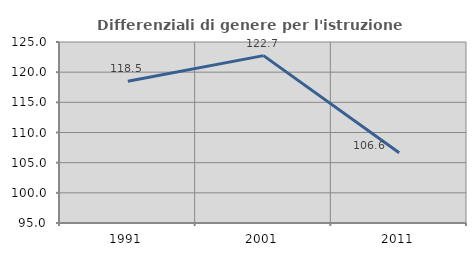
| Category | Differenziali di genere per l'istruzione superiore |
|---|---|
| 1991.0 | 118.486 |
| 2001.0 | 122.746 |
| 2011.0 | 106.645 |